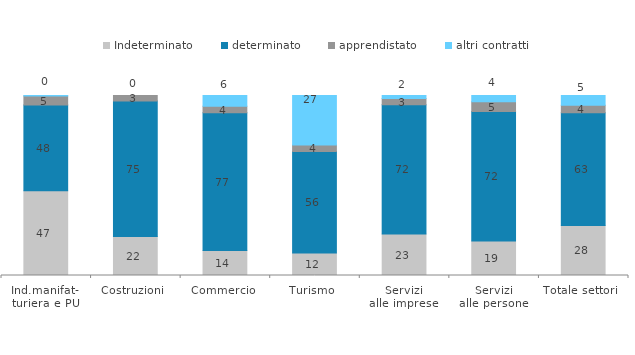
| Category | Indeterminato | determinato | apprendistato | altri contratti |
|---|---|---|---|---|
| Ind.manifat-
turiera e PU | 47.061 | 47.637 | 5.033 | 0.269 |
| Costruzioni | 21.606 | 75.325 | 3.07 | 0 |
| Commercio | 13.867 | 76.55 | 3.608 | 5.975 |
| Turismo | 12.435 | 56.39 | 3.713 | 27.461 |
| Servizi
alle imprese | 23.119 | 71.804 | 3.425 | 1.651 |
| Servizi
alle persone | 19.221 | 71.859 | 5.402 | 3.518 |
| Totale settori | 27.832 | 62.528 | 4.176 | 5.463 |